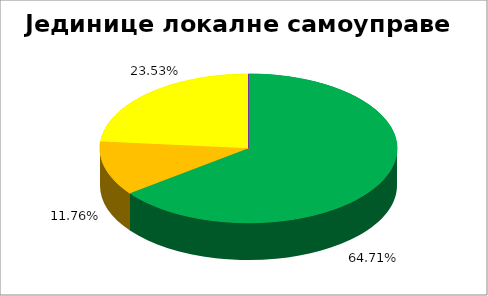
| Category | Jединице локалне самоуправе |
|---|---|
| 0 | 0.647 |
| 1 | 0.118 |
| 2 | 0.235 |
| 3 | 0 |
| 4 | 0 |